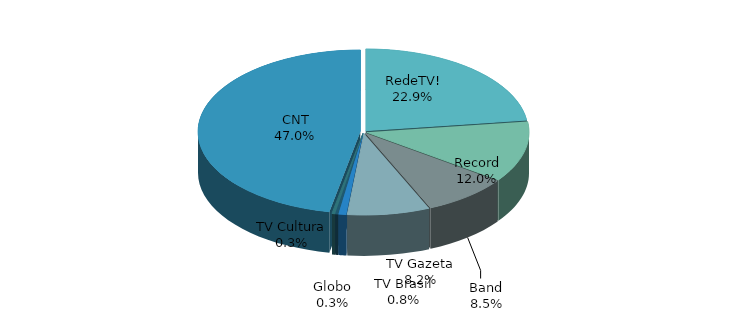
| Category | Series 0 |
|---|---|
| CNT | 0.47 |
| RedeTV! | 0.229 |
| Record | 0.12 |
| Band | 0.085 |
| TV Gazeta | 0.082 |
| TV Brasil | 0.008 |
| Globo | 0.003 |
| TV Cultura | 0.003 |